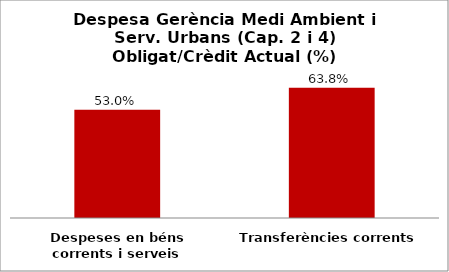
| Category | Series 0 |
|---|---|
| Despeses en béns corrents i serveis | 0.53 |
| Transferències corrents | 0.638 |